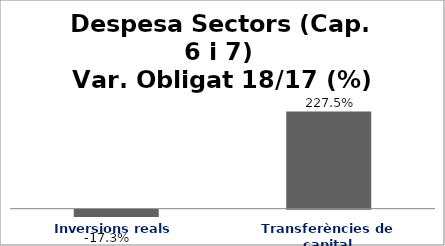
| Category | Series 0 |
|---|---|
| Inversions reals | -0.173 |
| Transferències de capital | 2.275 |